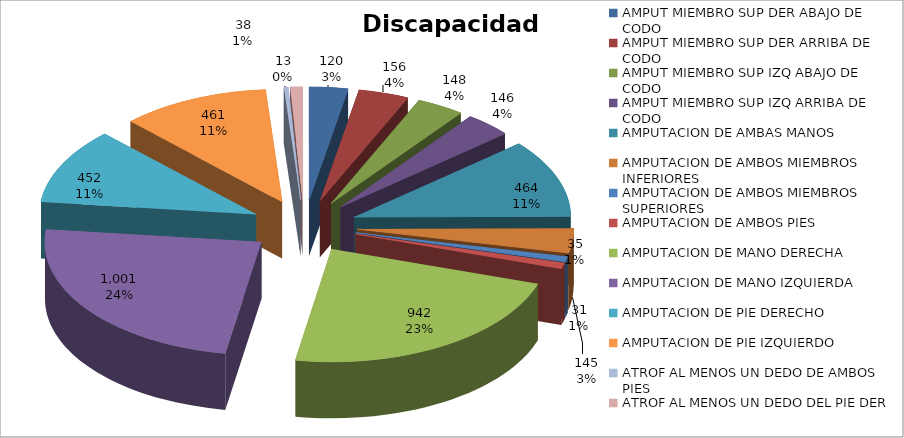
| Category | Series 0 | Series 1 | Series 2 |
|---|---|---|---|
| AMPUT MIEMBRO SUP DER ABAJO DE CODO | 120 | 2 | 122 |
| AMPUT MIEMBRO SUP DER ARRIBA DE CODO | 156 | 3 | 159 |
| AMPUT MIEMBRO SUP IZQ ABAJO DE CODO | 148 | 5 | 153 |
| AMPUT MIEMBRO SUP IZQ ARRIBA DE CODO | 146 | 0 | 146 |
| AMPUTACION DE AMBAS MANOS | 464 | 0 | 464 |
| AMPUTACION DE AMBOS MIEMBROS INFERIORES | 145 | 5 | 150 |
| AMPUTACION DE AMBOS MIEMBROS SUPERIORES | 31 | 1 | 32 |
| AMPUTACION DE AMBOS PIES | 35 | 2 | 37 |
| AMPUTACION DE MANO DERECHA | 942 | 9 | 951 |
| AMPUTACION DE MANO IZQUIERDA | 1001 | 16 | 1017 |
| AMPUTACION DE PIE DERECHO | 452 | 8 | 460 |
| AMPUTACION DE PIE IZQUIERDO | 461 | 3 | 464 |
| ATROF AL MENOS UN DEDO DE AMBOS PIES | 13 | 0 | 13 |
| ATROF AL MENOS UN DEDO DEL PIE DER | 38 | 3 | 41 |